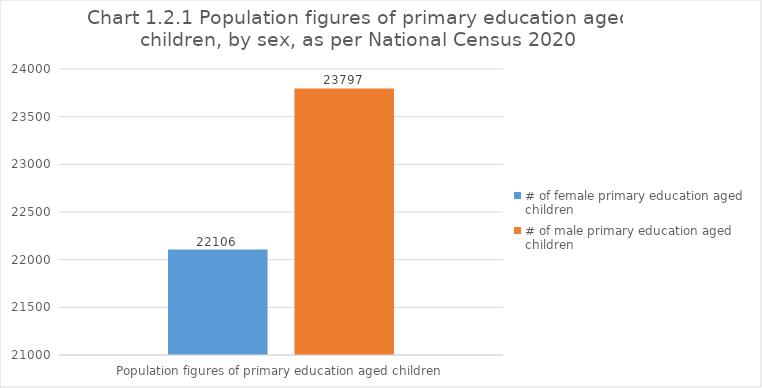
| Category | # of female primary education aged children | # of male primary education aged children |
|---|---|---|
| 0 | 22105.523 | 23796.513 |